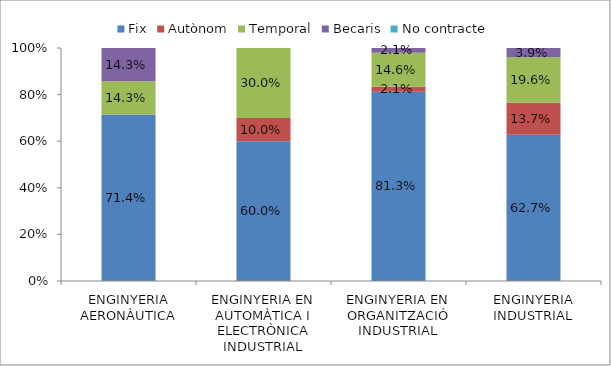
| Category | Fix | Autònom | Temporal | Becaris | No contracte |
|---|---|---|---|---|---|
| ENGINYERIA AERONÀUTICA | 0.714 | 0 | 0.143 | 0.143 | 0 |
| ENGINYERIA EN AUTOMÀTICA I ELECTRÒNICA INDUSTRIAL | 0.6 | 0.1 | 0.3 | 0 | 0 |
| ENGINYERIA EN ORGANITZACIÓ INDUSTRIAL | 0.812 | 0.021 | 0.146 | 0.021 | 0 |
| ENGINYERIA INDUSTRIAL | 0.627 | 0.137 | 0.196 | 0.039 | 0 |